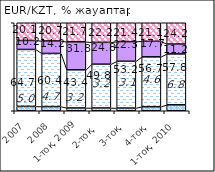
| Category | оң | әсер етпеді | теріс | білмеймін |
|---|---|---|---|---|
| 2007 | 4.98 | 64.665 | 10.245 | 20.11 |
| 2008 | 4.748 | 60.38 | 14.2 | 20.672 |
| 1-тоқ. 2009 | 3.2 | 43.35 | 31.78 | 21.67 |
| 2-тоқ.  | 3.19 | 49.75 | 24.82 | 22.24 |
| 3-тоқ. | 3.08 | 53.18 | 22.31 | 21.43 |
| 4-тоқ. | 4.62 | 56.65 | 17.66 | 21.07 |
| 1-тоқ. 2010  | 6.78 | 57.81 | 11.23 | 24.18 |